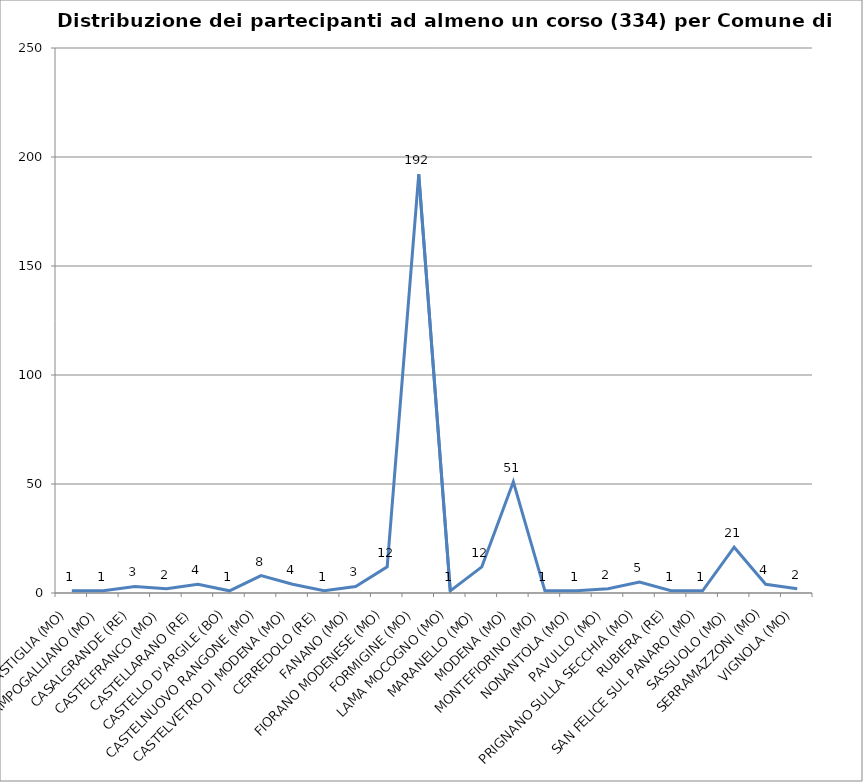
| Category | Nr. Tesserati |
|---|---|
| BASTIGLIA (MO) | 1 |
| CAMPOGALLIANO (MO) | 1 |
| CASALGRANDE (RE) | 3 |
| CASTELFRANCO (MO) | 2 |
| CASTELLARANO (RE) | 4 |
| CASTELLO D'ARGILE (BO) | 1 |
| CASTELNUOVO RANGONE (MO) | 8 |
| CASTELVETRO DI MODENA (MO) | 4 |
| CERREDOLO (RE) | 1 |
| FANANO (MO) | 3 |
| FIORANO MODENESE (MO) | 12 |
| FORMIGINE (MO) | 192 |
| LAMA MOCOGNO (MO) | 1 |
| MARANELLO (MO) | 12 |
| MODENA (MO) | 51 |
| MONTEFIORINO (MO) | 1 |
| NONANTOLA (MO) | 1 |
| PAVULLO (MO) | 2 |
| PRIGNANO SULLA SECCHIA (MO) | 5 |
| RUBIERA (RE) | 1 |
| SAN FELICE SUL PANARO (MO) | 1 |
| SASSUOLO (MO) | 21 |
| SERRAMAZZONI (MO) | 4 |
| VIGNOLA (MO) | 2 |